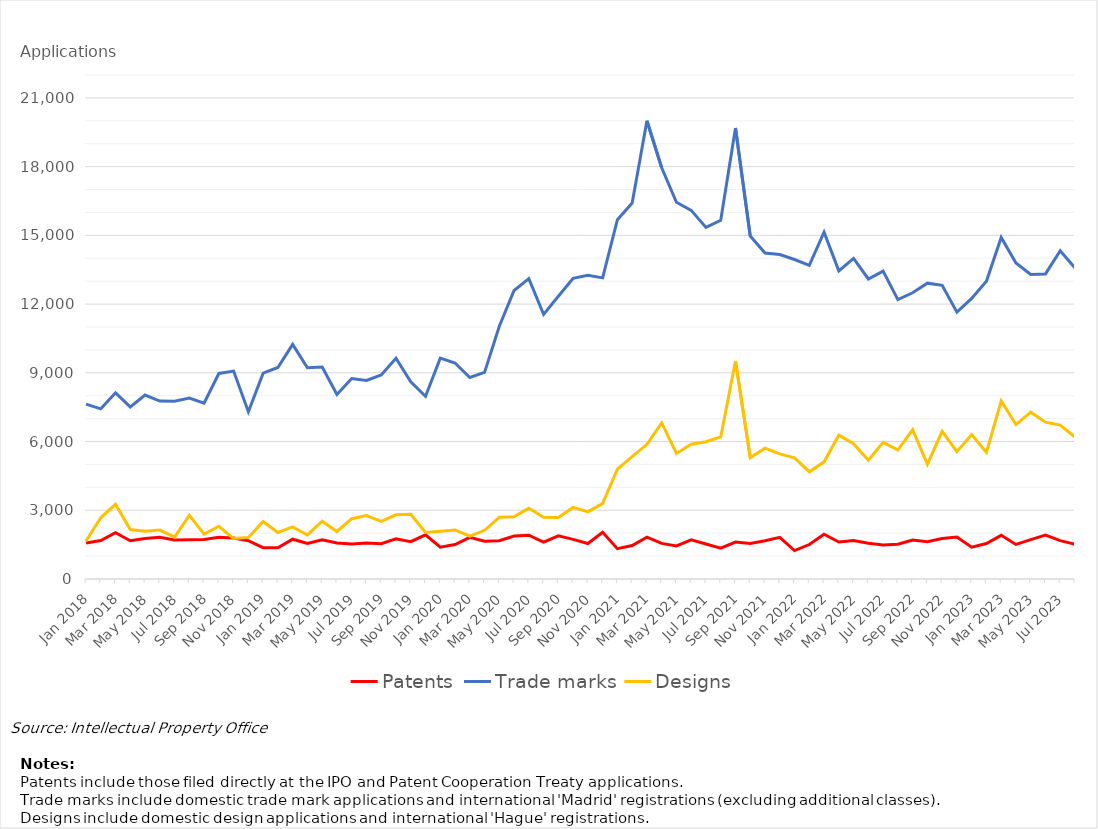
| Category | Patents | Trade marks | Designs |
|---|---|---|---|
| Jan 2018 | 1575 | 7634 | 1658 |
| Feb 2018 | 1676 | 7428 | 2672 |
| Mar 2018 | 2022 | 8127 | 3267 |
| Apr 2018 | 1670 | 7512 | 2160 |
| May 2018 | 1767 | 8030 | 2083 |
| Jun 2018 | 1821 | 7769 | 2136 |
| Jul 2018 | 1704 | 7757 | 1832 |
| Aug 2018 | 1713 | 7897 | 2777 |
| Sep 2018 | 1725 | 7673 | 1960 |
| Oct 2018 | 1818 | 8972 | 2302 |
| Nov 2018 | 1787 | 9076 | 1765 |
| Dec 2018 | 1670 | 7304 | 1815 |
| Jan 2019 | 1367 | 8985 | 2505 |
| Feb 2019 | 1361 | 9234 | 2031 |
| Mar 2019 | 1737 | 10243 | 2274 |
| Apr 2019 | 1552 | 9219 | 1923 |
| May 2019 | 1710 | 9251 | 2520 |
| Jun 2019 | 1569 | 8053 | 2074 |
| Jul 2019 | 1527 | 8752 | 2634 |
| Aug 2019 | 1571 | 8670 | 2768 |
| Sep 2019 | 1540 | 8908 | 2511 |
| Oct 2019 | 1755 | 9636 | 2800 |
| Nov 2019 | 1630 | 8607 | 2827 |
| Dec 2019 | 1926 | 7970 | 2028 |
| Jan 2020 | 1391 | 9642 | 2082 |
| Feb 2020 | 1504 | 9428 | 2143 |
| Mar 2020 | 1819 | 8794 | 1872 |
| Apr 2020 | 1648 | 9021 | 2127 |
| May 2020 | 1672 | 11035 | 2695 |
| Jun 2020 | 1879 | 12593 | 2721 |
| Jul 2020 | 1912 | 13110 | 3086 |
| Aug 2020 | 1613 | 11551 | 2695 |
| Sep 2020 | 1886 | 12340 | 2686 |
| Oct 2020 | 1730 | 13126 | 3124 |
| Nov 2020 | 1547 | 13254 | 2930 |
| Dec 2020 | 2042 | 13144 | 3302 |
| Jan 2021 | 1324 | 15685 | 4792 |
| Feb 2021 | 1462 | 16413 | 5340 |
| Mar 2021 | 1828 | 20001 | 5878 |
| Apr 2021 | 1554 | 17951 | 6815 |
| May 2021 | 1446 | 16446 | 5480 |
| Jun 2021 | 1712 | 16090 | 5881 |
| Jul 2021 | 1528 | 15346 | 5989 |
| Aug 2021 | 1344 | 15659 | 6200 |
| Sep 2021 | 1615 | 19685 | 9517 |
| Oct 2021 | 1547 | 14968 | 5292 |
| Nov 2021 | 1670 | 14232 | 5712 |
| Dec 2021 | 1817 | 14162 | 5464 |
| Jan 2022 | 1240 | 13945 | 5288 |
| Feb 2022 | 1505 | 13690 | 4683 |
| Mar 2022 | 1952 | 15142 | 5114 |
| Apr 2022 | 1616 | 13450 | 6282 |
| May 2022 | 1683 | 13992 | 5907 |
| Jun 2022 | 1561 | 13096 | 5183 |
| Jul 2022 | 1483 | 13439 | 5963 |
| Aug 2022 | 1520 | 12197 | 5639 |
| Sep 2022 | 1702 | 12493 | 6515 |
| Oct 2022 | 1630 | 12914 | 5012 |
| Nov 2022 | 1770 | 12819 | 6446 |
| Dec 2022 | 1828 | 11650 | 5558 |
| Jan 2023 | 1390 | 12250 | 6307 |
| Feb 2023 | 1551 | 13001 | 5528 |
| Mar 2023 | 1906 | 14909 | 7776 |
| Apr 2023 | 1507 | 13792 | 6740 |
| May 2023 | 1717 | 13292 | 7281 |
| Jun 2023 | 1921 | 13317 | 6847 |
| Jul 2023 | 1675 | 14327 | 6719 |
| Aug 2023 | 1518 | 13579 | 6193 |